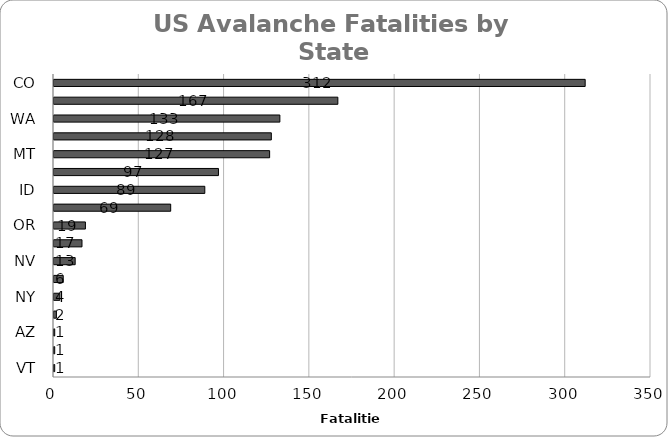
| Category | sum Killed |
|---|---|
| CO | 312 |
| AK | 167 |
| WA | 133 |
| UT | 128 |
| MT | 127 |
| WY | 97 |
| ID | 89 |
| CA | 69 |
| OR | 19 |
| NH | 17 |
| NV | 13 |
| NM | 6 |
| NY | 4 |
| ME | 2 |
| AZ | 1 |
| ND | 1 |
| VT | 1 |